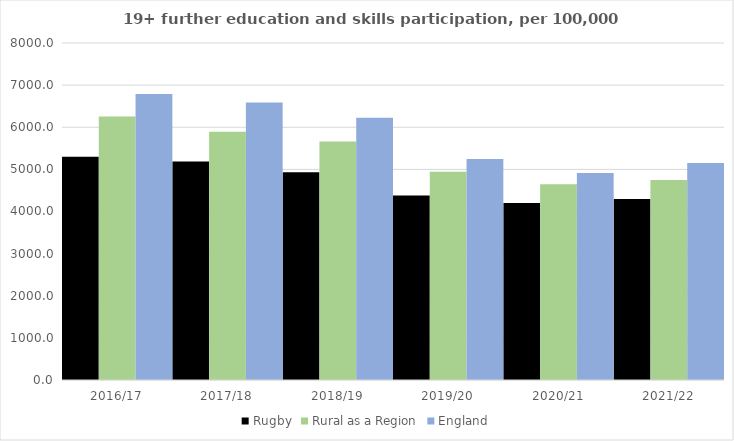
| Category | Rugby | Rural as a Region | England |
|---|---|---|---|
| 2016/17 | 5298 | 6253.401 | 6788 |
| 2017/18 | 5184 | 5892.029 | 6588 |
| 2018/19 | 4931 | 5661.873 | 6227 |
| 2019/20 | 4379 | 4943.801 | 5244 |
| 2020/21 | 4199 | 4646.727 | 4913 |
| 2021/22 | 4297 | 4747.049 | 5151 |